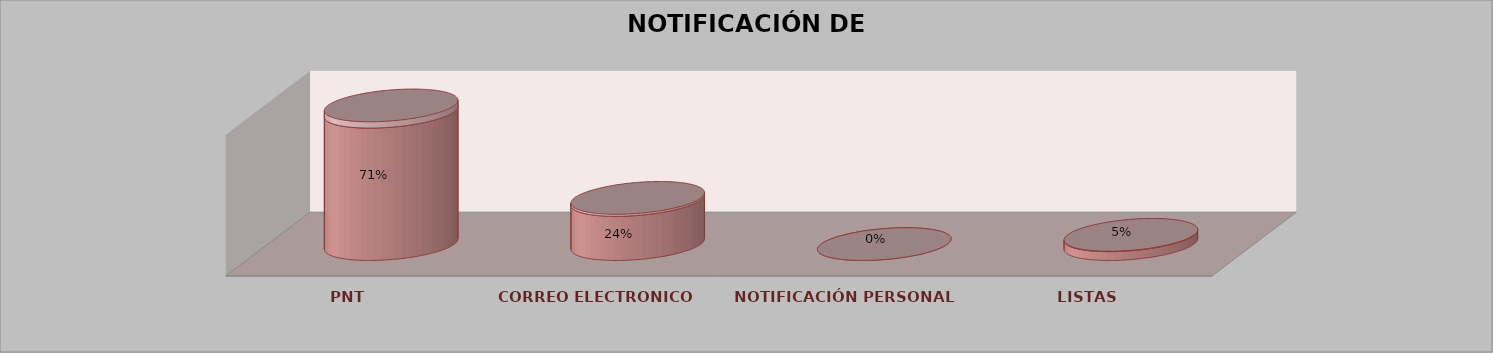
| Category | Series 0 | Series 1 | Series 2 | Series 3 | Series 4 |
|---|---|---|---|---|---|
| PNT |  |  |  | 15 | 0.714 |
| CORREO ELECTRONICO |  |  |  | 5 | 0.238 |
| NOTIFICACIÓN PERSONAL |  |  |  | 0 | 0 |
| LISTAS |  |  |  | 1 | 0.048 |